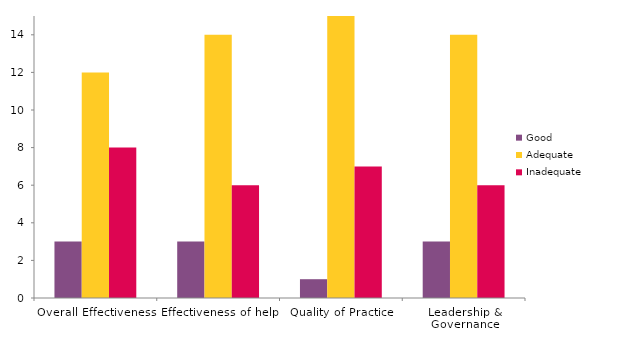
| Category | Good | Adequate | Inadequate |
|---|---|---|---|
| Overall Effectiveness | 3 | 12 | 8 |
| Effectiveness of help | 3 | 14 | 6 |
| Quality of Practice | 1 | 15 | 7 |
| Leadership & Governance | 3 | 14 | 6 |